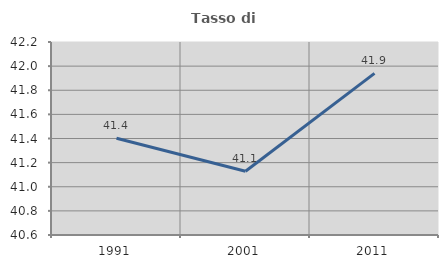
| Category | Tasso di occupazione   |
|---|---|
| 1991.0 | 41.402 |
| 2001.0 | 41.128 |
| 2011.0 | 41.94 |